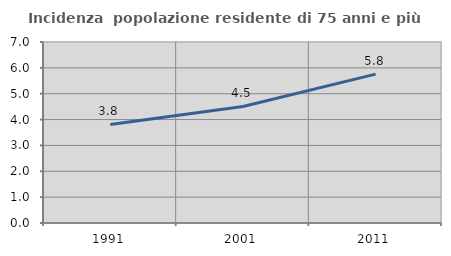
| Category | Incidenza  popolazione residente di 75 anni e più |
|---|---|
| 1991.0 | 3.813 |
| 2001.0 | 4.507 |
| 2011.0 | 5.756 |